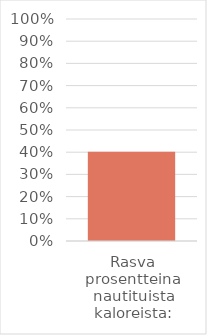
| Category | Series 0 |
|---|---|
| Rasva prosentteina nautituista kaloreista: | 0.402 |